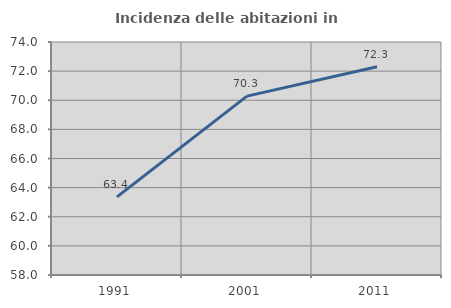
| Category | Incidenza delle abitazioni in proprietà  |
|---|---|
| 1991.0 | 63.367 |
| 2001.0 | 70.282 |
| 2011.0 | 72.301 |